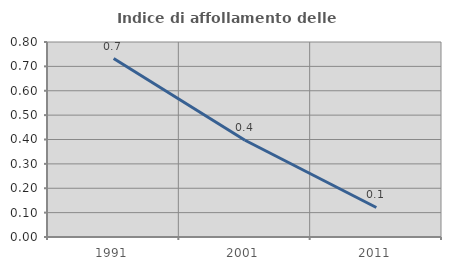
| Category | Indice di affollamento delle abitazioni  |
|---|---|
| 1991.0 | 0.732 |
| 2001.0 | 0.397 |
| 2011.0 | 0.121 |